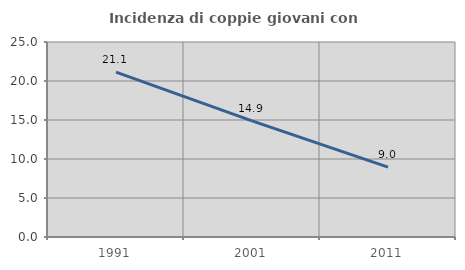
| Category | Incidenza di coppie giovani con figli |
|---|---|
| 1991.0 | 21.137 |
| 2001.0 | 14.885 |
| 2011.0 | 8.957 |